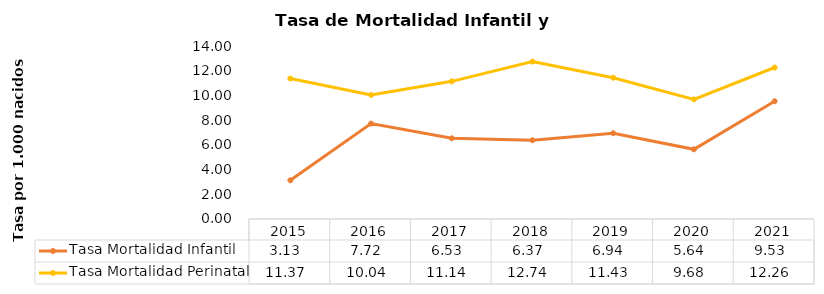
| Category | Tasa Mortalidad Infantil | Tasa Mortalidad Perinatal |
|---|---|---|
| 0 | 3.13 | 11.37 |
| 1 | 7.72 | 10.04 |
| 2 | 6.53 | 11.14 |
| 3 | 6.37 | 12.74 |
| 4 | 6.94 | 11.43 |
| 5 | 5.64 | 9.68 |
| 6 | 9.53 | 12.26 |